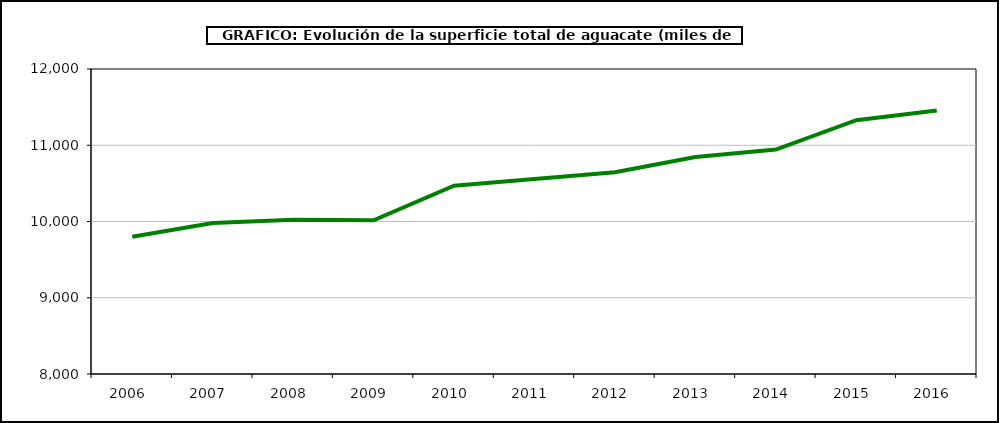
| Category | superficie aguacate |
|---|---|
| 2006.0 | 9801 |
| 2007.0 | 9981 |
| 2008.0 | 10023 |
| 2009.0 | 10016 |
| 2010.0 | 10470 |
| 2011.0 | 10558 |
| 2012.0 | 10645 |
| 2013.0 | 10845 |
| 2014.0 | 10943 |
| 2015.0 | 11329 |
| 2016.0 | 11455 |